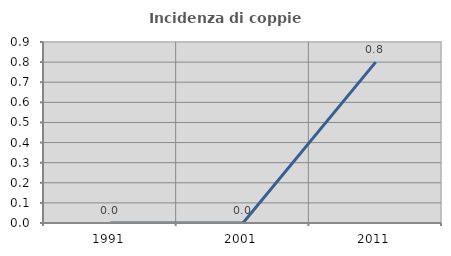
| Category | Incidenza di coppie miste |
|---|---|
| 1991.0 | 0 |
| 2001.0 | 0 |
| 2011.0 | 0.8 |